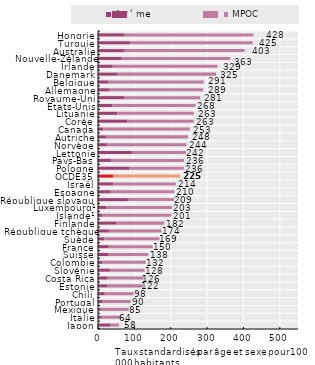
| Category | Asthme | MPOC |
|---|---|---|
| Japon | 34.658 | 23.469 |
| Italie | 9.469 | 54.352 |
| Mexique | 7.637 | 76.863 |
| Portugal | 12.877 | 76.947 |
| Chili | 18.486 | 79.631 |
| Estonie | 25.91 | 96.481 |
| Costa Rica | 26.745 | 98.756 |
| Slovénie | 32.782 | 95.205 |
| Colombie | 12.106 | 119.552 |
| Suisse | 27.516 | 110.583 |
| France | 29.569 | 120.406 |
| Suède | 17.31 | 151.545 |
| République tchèque | 30.661 | 143.745 |
| Finlande | 49.436 | 132.57 |
| Islande¹ | 12.302 | 189.139 |
| Luxembourg¹ | 22.56 | 180.722 |
| République slovaque | 82.147 | 126.669 |
| Espagne | 35.062 | 174.682 |
| Israël | 42.291 | 171.695 |
| OCDE35 | 41.881 | 183.288 |
| Pologne | 85.578 | 150.346 |
| Pays-Bas | 36.784 | 199.568 |
| Lettonie | 93.11 | 148.414 |
| Norvège | 24.453 | 219.229 |
| Autriche | 21.831 | 225.686 |
| Canada | 14.732 | 238.026 |
| Corée | 81.042 | 182.149 |
| Lituanie | 52.796 | 210.562 |
| États-Unis | 39.24 | 228.94 |
| Royaume-Uni | 73.067 | 207.975 |
| Allemagne | 30.26 | 259.197 |
| Belgique | 28.933 | 261.637 |
| Danemark | 54.085 | 270.618 |
| Irlande | 40.588 | 288.023 |
| Nouvelle-Zélande | 65.326 | 297.907 |
| Australie | 71.256 | 332.002 |
| Turquie | 88.794 | 335.865 |
| Hongrie | 73.296 | 354.221 |